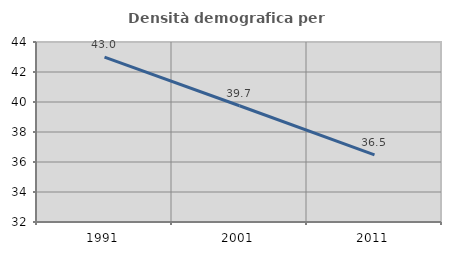
| Category | Densità demografica |
|---|---|
| 1991.0 | 42.988 |
| 2001.0 | 39.749 |
| 2011.0 | 36.475 |